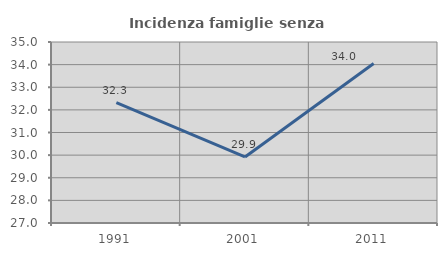
| Category | Incidenza famiglie senza nuclei |
|---|---|
| 1991.0 | 32.319 |
| 2001.0 | 29.92 |
| 2011.0 | 34.048 |